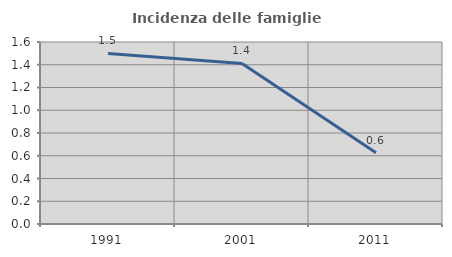
| Category | Incidenza delle famiglie numerose |
|---|---|
| 1991.0 | 1.499 |
| 2001.0 | 1.411 |
| 2011.0 | 0.627 |